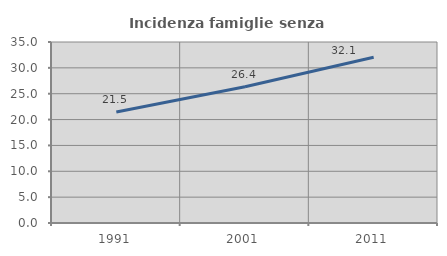
| Category | Incidenza famiglie senza nuclei |
|---|---|
| 1991.0 | 21.479 |
| 2001.0 | 26.352 |
| 2011.0 | 32.054 |